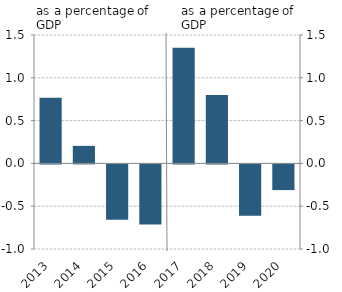
| Category | Fiskális impulzus |
|---|---|
| 2013.0 | 0.768 |
| 2014.0 | 0.205 |
| 2015.0 | -0.646 |
| 2016.0 | -0.702 |
| 2017.0 | 1.35 |
| 2018.0 | 0.8 |
| 2019.0 | -0.6 |
| 2020.0 | -0.3 |